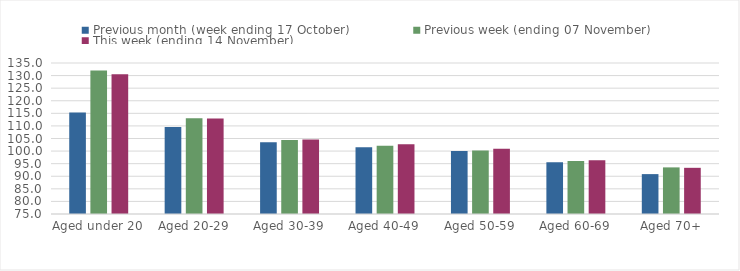
| Category | Previous month (week ending 17 October) | Previous week (ending 07 November) | This week (ending 14 November) |
|---|---|---|---|
| Aged under 20 | 115.32 | 132.03 | 130.56 |
| Aged 20-29 | 109.54 | 113.04 | 112.92 |
| Aged 30-39 | 103.51 | 104.4 | 104.62 |
| Aged 40-49 | 101.51 | 102.1 | 102.74 |
| Aged 50-59 | 100.08 | 100.25 | 100.89 |
| Aged 60-69 | 95.6 | 96.03 | 96.4 |
| Aged 70+ | 90.85 | 93.52 | 93.35 |